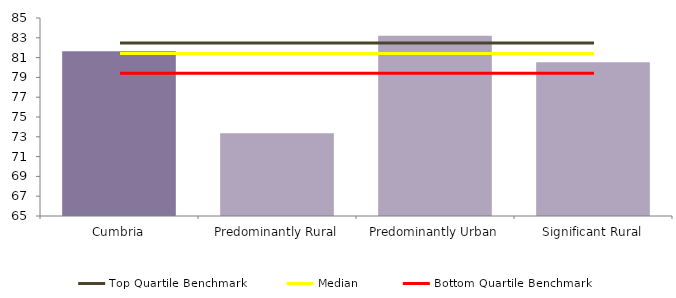
| Category | Series 0 |
|---|---|
| Cumbria | 81.645 |
| Predominantly Rural | 73.356 |
| Predominantly Urban | 83.212 |
| Significant Rural | 80.53 |